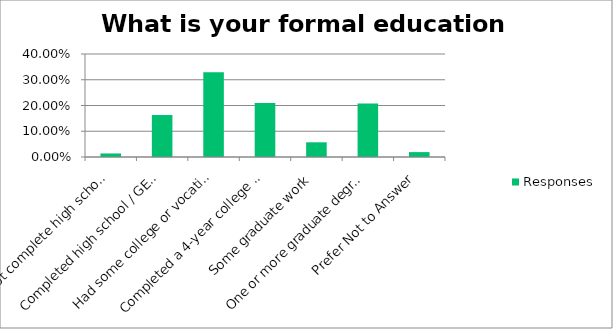
| Category | Responses |
|---|---|
| Did not complete high school | 0.014 |
| Completed high school / GED (12th grade) | 0.163 |
| Had some college or vocational school beyond high school | 0.33 |
| Completed a 4-year college degree program | 0.21 |
| Some graduate work | 0.057 |
| One or more graduate degrees | 0.208 |
| Prefer Not to Answer | 0.019 |